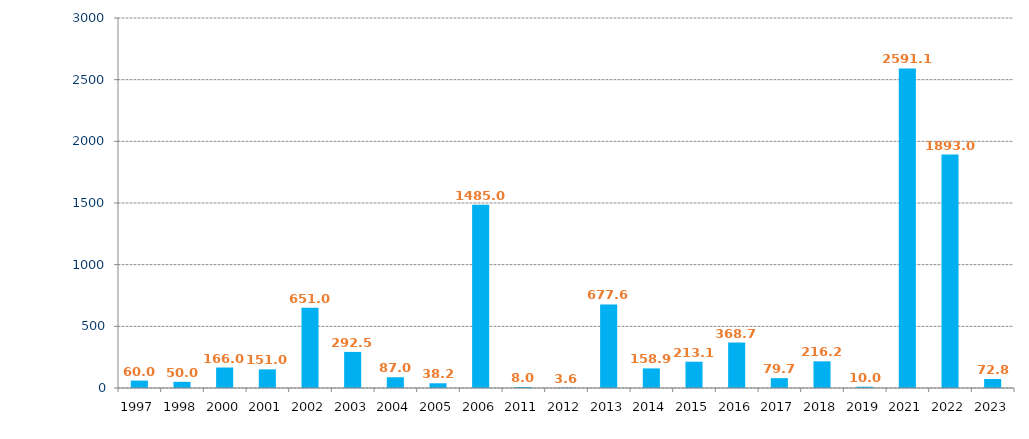
| Category | Multa (UIT) |
|---|---|
| 1997.0 | 60 |
| 1998.0 | 50 |
| 2000.0 | 166 |
| 2001.0 | 151 |
| 2002.0 | 651 |
| 2003.0 | 292.5 |
| 2004.0 | 87 |
| 2005.0 | 38.2 |
| 2006.0 | 1485 |
| 2011.0 | 8 |
| 2012.0 | 3.56 |
| 2013.0 | 677.62 |
| 2014.0 | 158.9 |
| 2015.0 | 213.06 |
| 2016.0 | 368.66 |
| 2017.0 | 79.65 |
| 2018.0 | 216.2 |
| 2019.0 | 10 |
| 2021.0 | 2591.05 |
| 2022.0 | 1893.003 |
| 2023.0 | 72.79 |